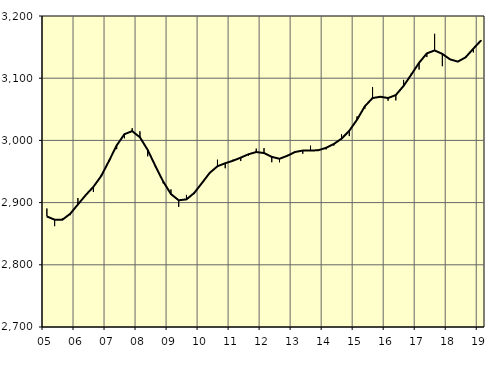
| Category | Trend | Originalvärden |
|---|---|---|
| 5.0 | 2877.74 | 2890.5 |
| nan | 2872.5 | 2862.1 |
| 6.0 | 2872.5 | 2874.8 |
| 6.0 | 2881.91 | 2879.7 |
| 6.0 | 2897 | 2907.3 |
| nan | 2911.92 | 2910.3 |
| 7.0 | 2925.4 | 2917 |
| 7.0 | 2942.61 | 2944.8 |
| 7.0 | 2966.7 | 2968.7 |
| nan | 2991.89 | 2985.9 |
| 8.0 | 3010 | 3003.4 |
| 8.0 | 3014.92 | 3019.6 |
| 8.0 | 3004.99 | 3014.6 |
| nan | 2984.69 | 2974.4 |
| 9.0 | 2958.71 | 2956.6 |
| 9.0 | 2933.93 | 2930.9 |
| 9.0 | 2913.73 | 2921.2 |
| nan | 2903.73 | 2893.1 |
| 10.0 | 2905.17 | 2912.4 |
| 10.0 | 2915.48 | 2913.7 |
| 10.0 | 2931.47 | 2931.8 |
| nan | 2947.79 | 2948.6 |
| 11.0 | 2958.46 | 2969 |
| 11.0 | 2963.31 | 2955.2 |
| 11.0 | 2967.29 | 2969.1 |
| nan | 2972.32 | 2966.8 |
| 12.0 | 2977.74 | 2975.6 |
| 12.0 | 2981.29 | 2986.8 |
| 12.0 | 2979.65 | 2987.6 |
| nan | 2973.54 | 2964.9 |
| 13.0 | 2970.5 | 2964.8 |
| 13.0 | 2975.23 | 2976.8 |
| 13.0 | 2981.34 | 2980.1 |
| nan | 2983.69 | 2978.5 |
| 14.0 | 2983.67 | 2991.5 |
| 14.0 | 2984.17 | 2985.2 |
| 14.0 | 2988.03 | 2985.5 |
| nan | 2994.19 | 2991.7 |
| 15.0 | 3002.79 | 3009.7 |
| 15.0 | 3015.49 | 3006.9 |
| 15.0 | 3033.32 | 3038.7 |
| nan | 3054.79 | 3050.9 |
| 16.0 | 3068.07 | 3085.9 |
| 16.0 | 3070.17 | 3069.2 |
| 16.0 | 3068.09 | 3063.7 |
| nan | 3072.94 | 3064.3 |
| 17.0 | 3087.58 | 3097.3 |
| 17.0 | 3105.89 | 3108.4 |
| 17.0 | 3124.79 | 3113.9 |
| nan | 3139.88 | 3134 |
| 18.0 | 3144.62 | 3171.4 |
| 18.0 | 3139.07 | 3119.3 |
| 18.0 | 3130.23 | 3129.3 |
| nan | 3126.69 | 3127.5 |
| 19.0 | 3133.52 | 3135.1 |
| 19.0 | 3147.56 | 3141.4 |
| 19.0 | 3160.81 | 3159.9 |